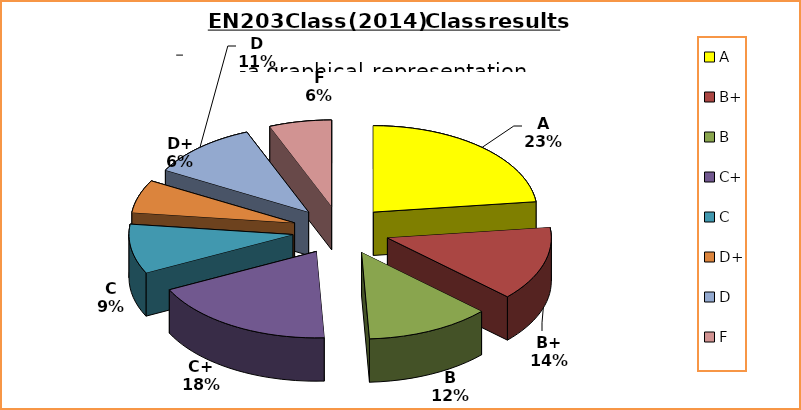
| Category | Series 0 |
|---|---|
| A | 15 |
| B+ | 9 |
| B | 8 |
| C+ | 12 |
| C | 6 |
| D+ | 4 |
| D | 7 |
| F | 4 |